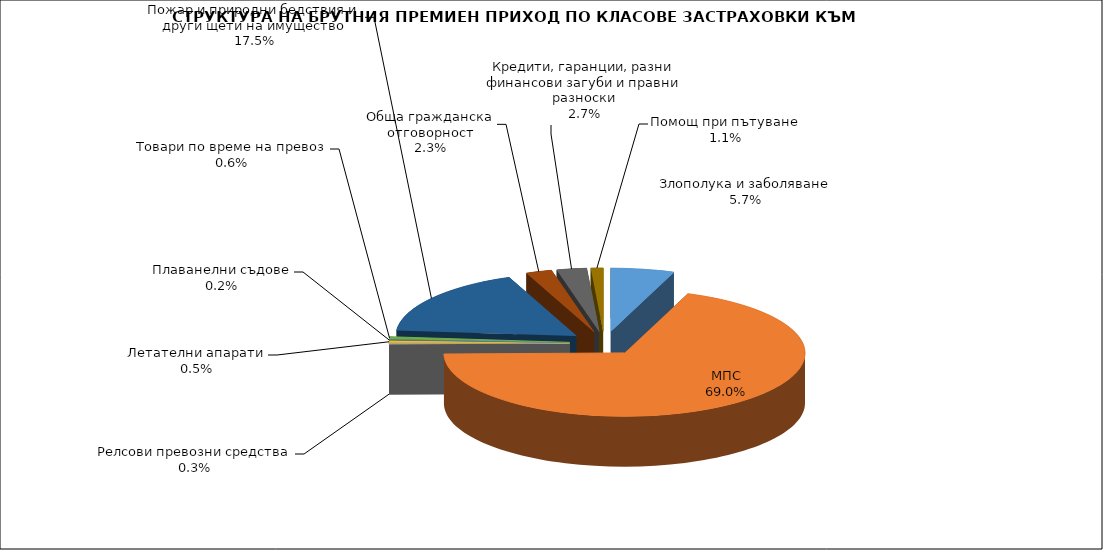
| Category | Злополука и заболяване |
|---|---|
| Злополука и заболяване | 0.057 |
| МПС | 0.69 |
| Релсови превозни средства | 0.003 |
| Летателни апарати | 0.005 |
| Плаванелни съдове | 0.002 |
| Товари по време на превоз | 0.006 |
| Пожар и природни бедствия и други щети на имущество | 0.175 |
| Обща гражданска отговорност | 0.023 |
| Кредити, гаранции, разни финансови загуби и правни разноски | 0.027 |
| Помощ при пътуване | 0.011 |